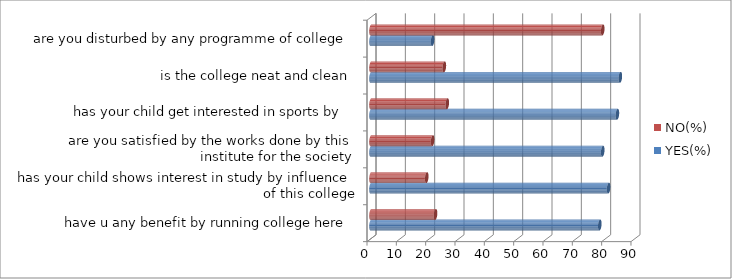
| Category | YES(%) | NO(%) |
|---|---|---|
| have u any benefit by running college here | 78 | 22 |
| has your child shows interest in study by influence of this college | 81 | 19 |
| are you satisfied by the works done by this institute for the society | 79 | 21 |
| has your child get interested in sports by  | 84 | 26 |
| is the college neat and clean | 85 | 25 |
| are you disturbed by any programme of college | 21 | 79 |